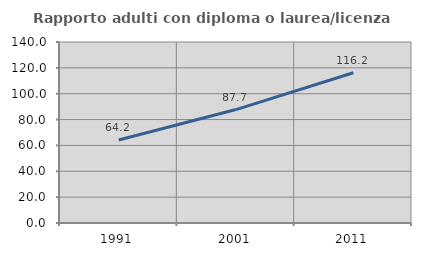
| Category | Rapporto adulti con diploma o laurea/licenza media  |
|---|---|
| 1991.0 | 64.196 |
| 2001.0 | 87.743 |
| 2011.0 | 116.235 |